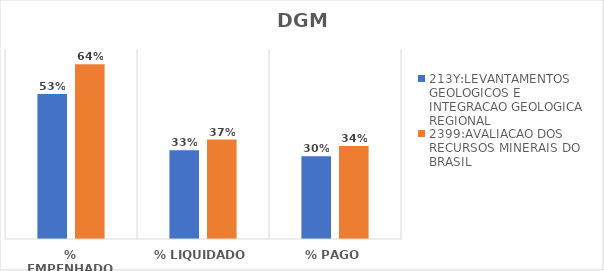
| Category | 213Y:LEVANTAMENTOS GEOLOGICOS E INTEGRACAO GEOLOGICA REGIONAL | 2399:AVALIACAO DOS RECURSOS MINERAIS DO BRASIL |
|---|---|---|
| % EMPENHADO | 0.535 | 0.644 |
| % LIQUIDADO | 0.327 | 0.366 |
| % PAGO | 0.305 | 0.342 |